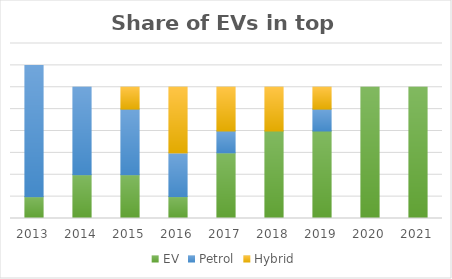
| Category | EV | Petrol | Hybrid |
|---|---|---|---|
| 2013.0 | 1 | 6 | 0 |
| 2014.0 | 2 | 4 | 0 |
| 2015.0 | 2 | 3 | 1 |
| 2016.0 | 1 | 2 | 3 |
| 2017.0 | 3 | 1 | 2 |
| 2018.0 | 4 | 0 | 2 |
| 2019.0 | 4 | 1 | 1 |
| 2020.0 | 6 | 0 | 0 |
| 2021.0 | 6 | 0 | 0 |